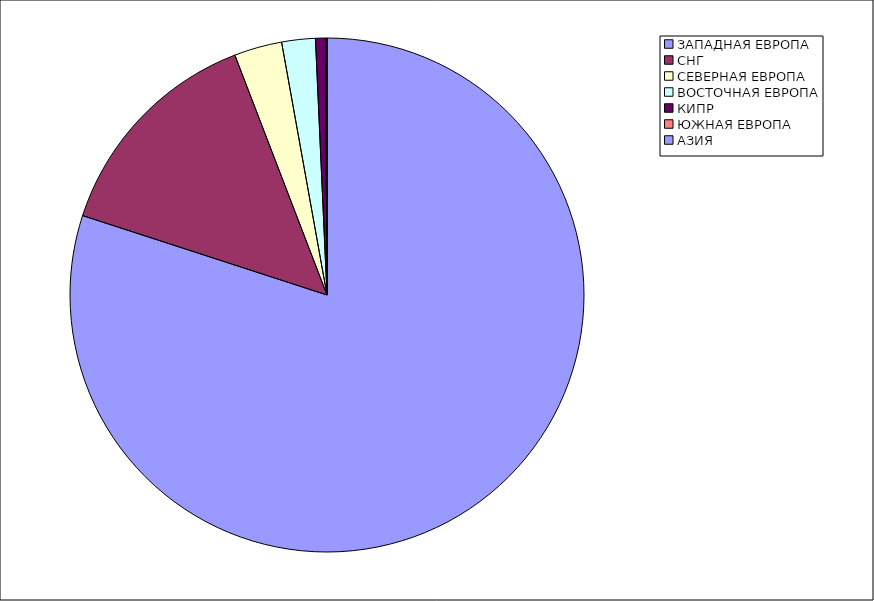
| Category | Оборот |
|---|---|
| ЗАПАДНАЯ ЕВРОПА | 0.8 |
| СНГ | 0.142 |
| СЕВЕРНАЯ ЕВРОПА | 0.03 |
| ВОСТОЧНАЯ ЕВРОПА | 0.021 |
| КИПР | 0.006 |
| ЮЖНАЯ ЕВРОПА | 0.001 |
| АЗИЯ | 0 |